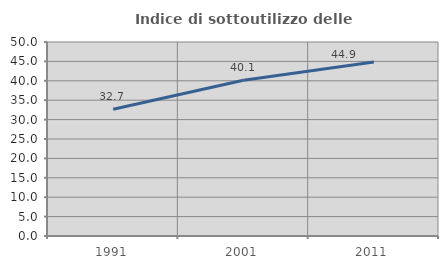
| Category | Indice di sottoutilizzo delle abitazioni  |
|---|---|
| 1991.0 | 32.666 |
| 2001.0 | 40.121 |
| 2011.0 | 44.873 |